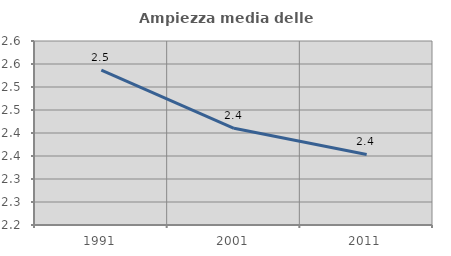
| Category | Ampiezza media delle famiglie |
|---|---|
| 1991.0 | 2.537 |
| 2001.0 | 2.41 |
| 2011.0 | 2.353 |